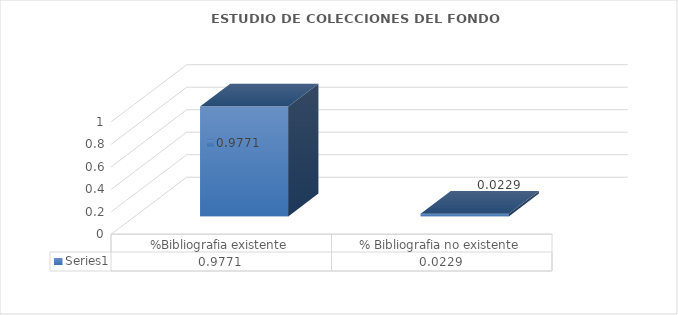
| Category | Series 0 |
|---|---|
| %Bibliografia existente | 0.977 |
| % Bibliografia no existente | 0.023 |